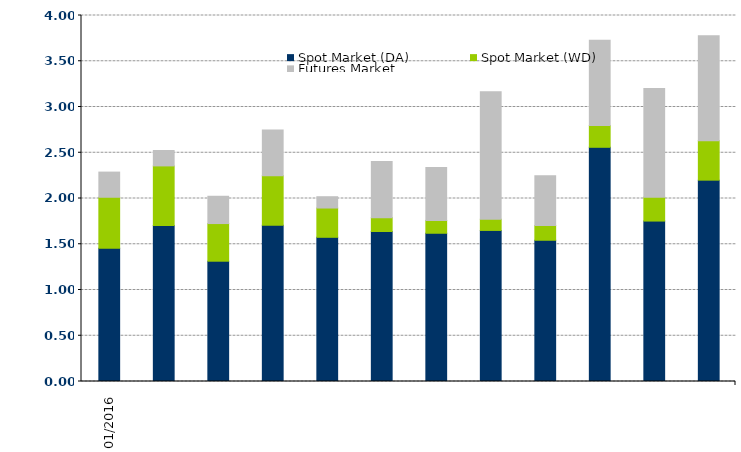
| Category | Spot Market (DA) | Spot Market (WD) | Futures Market |
|---|---|---|---|
| 2016-01-01 | 1.456 | 0.557 | 0.275 |
| 2016-02-01 | 1.705 | 0.651 | 0.168 |
| 2016-03-01 | 1.315 | 0.411 | 0.298 |
| 2016-04-01 | 1.708 | 0.541 | 0.499 |
| 2016-05-01 | 1.576 | 0.32 | 0.124 |
| 2016-06-01 | 1.64 | 0.151 | 0.615 |
| 2016-07-01 | 1.62 | 0.14 | 0.579 |
| 2016-08-01 | 1.651 | 0.122 | 1.393 |
| 2016-09-01 | 1.544 | 0.162 | 0.544 |
| 2016-10-01 | 2.56 | 0.239 | 0.933 |
| 2016-11-01 | 1.753 | 0.262 | 1.186 |
| 2016-12-01 | 2.2 | 0.432 | 1.147 |